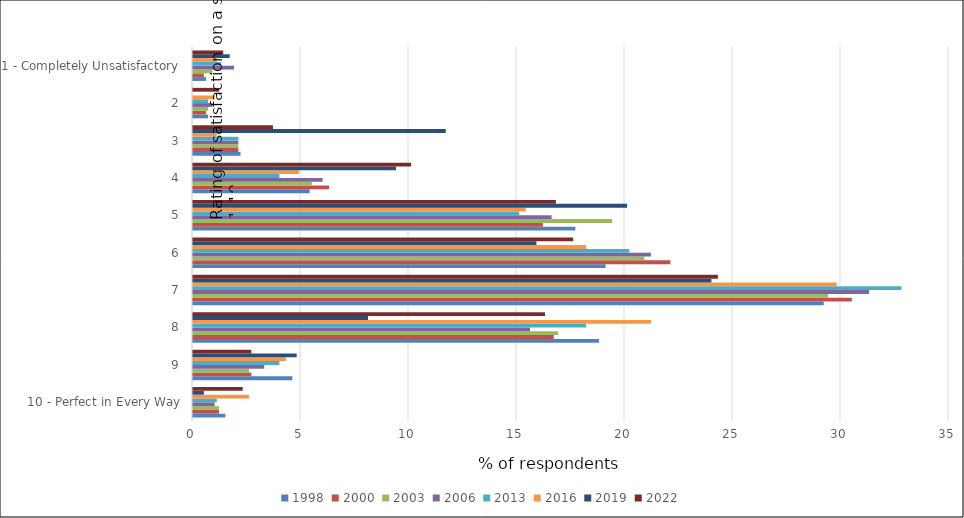
| Category | 1998 | 2000 | 2003 | 2006 | 2013 | 2016 | 2019 | 2022 |
|---|---|---|---|---|---|---|---|---|
| 10 - Perfect in Every Way | 1.5 | 1.2 | 1.2 | 1 | 1.1 | 2.6 | 0.5 | 2.3 |
| 9 | 4.6 | 2.7 | 2.6 | 3.3 | 4 | 4.3 | 4.8 | 2.7 |
| 8 | 18.8 | 16.7 | 16.9 | 15.6 | 18.2 | 21.2 | 8.1 | 16.3 |
| 7 | 29.2 | 30.5 | 29.4 | 31.3 | 32.8 | 29.8 | 24 | 24.3 |
| 6 | 19.1 | 22.1 | 20.9 | 21.2 | 20.2 | 18.2 | 15.9 | 17.6 |
| 5 | 17.7 | 16.2 | 19.4 | 16.6 | 15.1 | 15.4 | 20.1 | 16.8 |
| 4 | 5.4 | 6.3 | 5.5 | 6 | 4 | 4.9 | 9.4 | 10.1 |
| 3 | 2.2 | 2.1 | 2.1 | 2.1 | 2.1 | 1.1 | 11.7 | 3.7 |
| 2 | 0.7 | 0.6 | 0.7 | 0.9 | 0.7 | 1 | 0 | 1.2 |
| 1 - Completely Unsatisfactory | 0.6 | 0.5 | 0.9 | 1.9 | 1.3 | 1.1 | 1.7 | 1.4 |